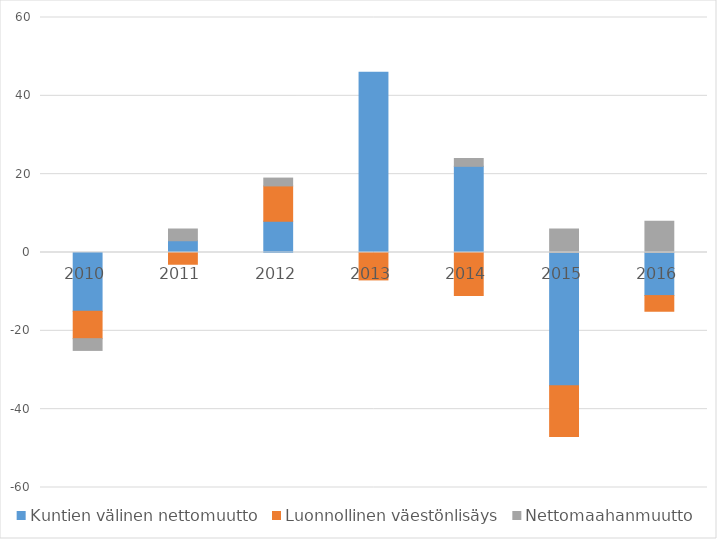
| Category | Kuntien välinen nettomuutto | Luonnollinen väestönlisäys | Nettomaahanmuutto |
|---|---|---|---|
| 2010 | -15 | -7 | -3 |
| 2011 | 3 | -3 | 3 |
| 2012 | 8 | 9 | 2 |
| 2013 | 46 | -7 | 0 |
| 2014 | 22 | -11 | 2 |
| 2015 | -34 | -13 | 6 |
| 2016 | -11 | -4 | 8 |